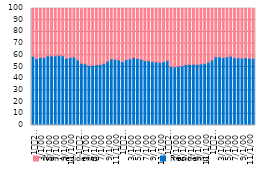
| Category | Residents | Non-residents  |
|---|---|---|
| 1
2012 | 59.2 | 40.9 |
| 2 | 57.3 | 42.7 |
| 3 | 58.2 | 41.8 |
| 4 | 58.1 | 42 |
| 5 | 59.5 | 40.5 |
| 6 | 59.5 | 40.5 |
| 7 | 59.4 | 40.6 |
| 8 | 60 | 40 |
| 9 | 59.6 | 40.4 |
| 10 | 57.5 | 42.5 |
| 11 | 58.1 | 41.9 |
| 12 | 58.5 | 41.5 |
| 1
2013 | 56 | 44 |
| 2 | 53.2 | 46.7 |
| 3 | 52.8 | 47.2 |
| 4 | 51.3 | 48.7 |
| 5 | 51.5 | 48.6 |
| 6 | 51.9 | 48.1 |
| 7 | 52.1 | 47.9 |
| 8 | 53 | 47 |
| 9 | 55 | 45 |
| 10 | 56.9 | 43.1 |
| 11 | 56.6 | 43.5 |
| 12 | 56.1 | 44 |
| 1
2014 | 54.5 | 45.6 |
| 2 | 56.3 | 43.7 |
| 3 | 56.9 | 43.1 |
| 4 | 58.1 | 42 |
| 5 | 57.3 | 42.7 |
| 6 | 56.6 | 43.4 |
| 7 | 55.5 | 44.5 |
| 8 | 55.3 | 44.7 |
| 9 | 54.6 | 45.3 |
| 10 | 54.4 | 45.6 |
| 11 | 53.9 | 46.1 |
| 12 | 54.5 | 45.4 |
| 1
2015 | 55.7 | 44.3 |
| 2 | 50.5 | 49.5 |
| 3 | 50.1 | 49.9 |
| 4 | 50.6 | 49.4 |
| 5 | 51 | 49 |
| 6 | 52.1 | 47.8 |
| 7 | 52.3 | 47.7 |
| 8 | 52.4 | 47.6 |
| 9 | 52.2 | 47.7 |
| 10 | 52.6 | 47.4 |
| 11 | 52.9 | 47.2 |
| 12 | 54.1 | 46 |
| 1
2016 | 55.9 | 44.1 |
| 2 | 58.8 | 41.2 |
| 3 | 58.6 | 41.4 |
| 4 | 58.1 | 41.9 |
| 5 | 58.6 | 41.4 |
| 6 | 59.3 | 40.7 |
| 7 | 57.9 | 42.2 |
| 8 | 57.8 | 42.2 |
| 9 | 57.5 | 42.5 |
| 10 | 57.9 | 42.1 |
| 11 | 57.5 | 42.5 |
| 12 | 57.4 | 42.6 |